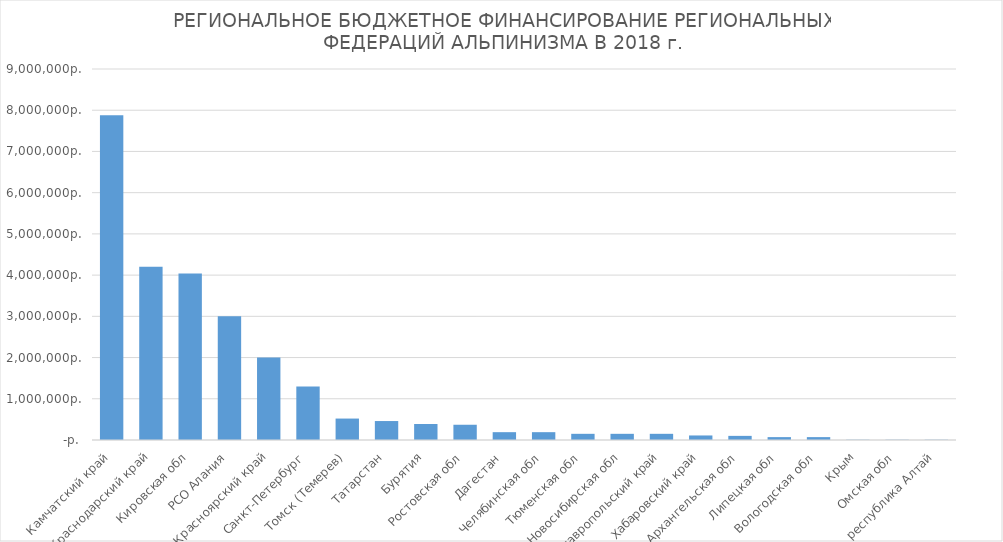
| Category | Series 0 |
|---|---|
| Камчатский край | 7880000 |
| Краснодарский край | 4200000 |
| Кировская обл | 4040000 |
| РСО Алания | 3000000 |
| Красноярский край | 2000000 |
| Санкт-Петербург | 1300000 |
| Томск (Темерев) | 520000 |
| Татарстан | 460000 |
| Бурятия | 388000 |
| Ростовская обл | 370000 |
| Дагестан | 190000 |
| Челябинская обл | 190000 |
| Тюменская обл | 150000 |
| Новосибирская обл | 150000 |
| Ставропольский край | 150000 |
| Хабаровский край | 110000 |
| Архангельская обл | 100000 |
| Липецкая обл | 70000 |
| Вологодская обл | 70000 |
| Крым | 6300 |
| Омская обл | 6000 |
| республика Алтай | 6000 |